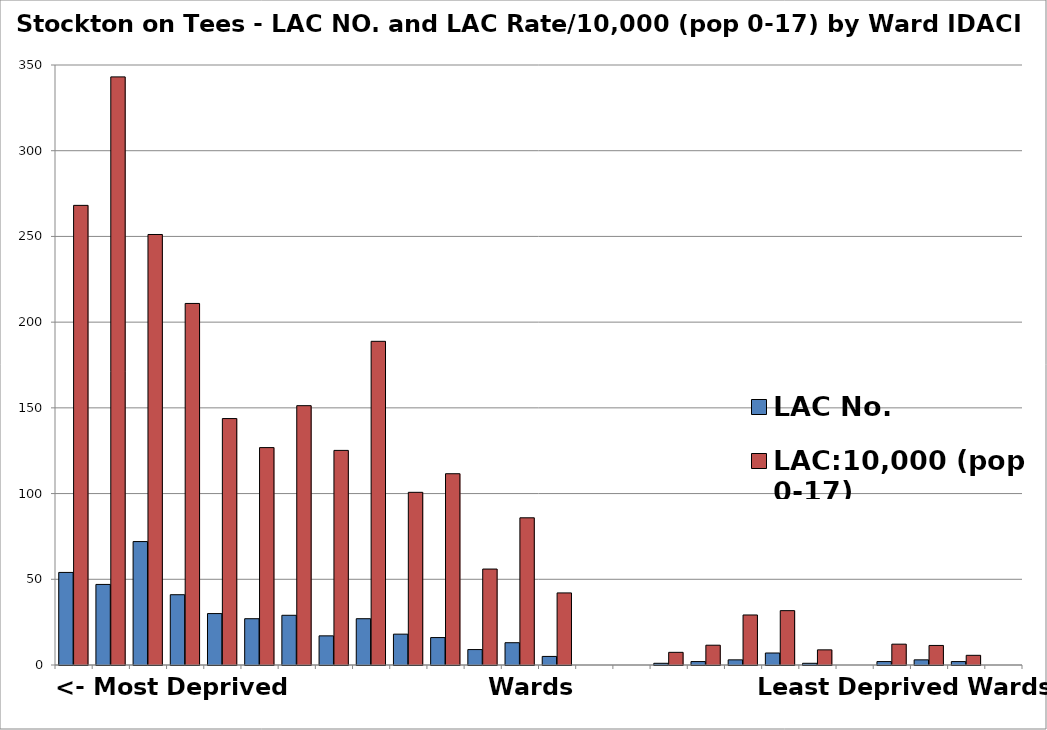
| Category | LAC No.  | LAC:10,000 (pop 0-17) |
|---|---|---|
| Newtown | 54 | 268.123 |
| Stockton Town Centre | 47 | 343.066 |
| Mandale and Victoria | 72 | 251.134 |
| Billingham East | 41 | 210.905 |
| Hardwick and Salters Lane | 30 | 143.747 |
| Parkfield and Oxbridge | 27 | 126.82 |
| Roseworth | 29 | 151.278 |
| Stainsby Hill | 17 | 125.184 |
| Norton North | 27 | 188.811 |
| Billingham Central | 18 | 100.727 |
| Norton South | 16 | 111.576 |
| Billingham South | 9 | 55.97 |
| Village | 13 | 85.865 |
| Bishopsgarth and Elm Tree | 5 | 42.052 |
| Fairfield | 0 | 0 |
| Western Parishes | 0 | 0 |
| Grangefield | 1 | 7.386 |
| Yarm | 2 | 11.547 |
| Norton West | 3 | 29.183 |
| Eaglescliffe | 7 | 31.703 |
| Hartburn | 1 | 8.834 |
| Billingham West | 0 | 0 |
| Billingham North | 2 | 12.158 |
| Ingleby Barwick East | 3 | 11.411 |
| Ingleby Barwick West | 2 | 5.647 |
| Northern Parishes | 0 | 0 |